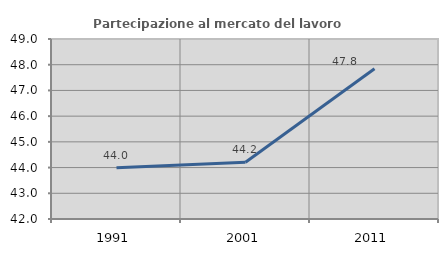
| Category | Partecipazione al mercato del lavoro  femminile |
|---|---|
| 1991.0 | 43.998 |
| 2001.0 | 44.208 |
| 2011.0 | 47.845 |